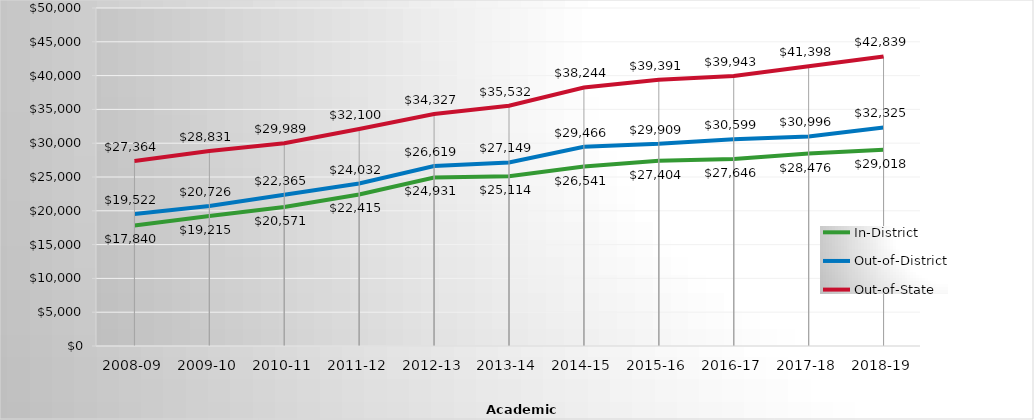
| Category | In-District | Out-of-District | Out-of-State |
|---|---|---|---|
| 2008-09 | 17839.697 | 19521.65 | 27363.58 |
| 2009-10 | 19215 | 20726 | 28831 |
| 2010-11 | 20571 | 22365 | 29989 |
| 2011-12 | 22415 | 24032 | 32100 |
| 2012-13 | 24931 | 26619 | 34327 |
| 2013-14 | 25114.27 | 27148.6 | 35532.25 |
| 2014-15 | 26541.34 | 29465.87 | 38243.8 |
| 2015-16 | 27404 | 29909 | 39391 |
| 2016-17 | 27646 | 30599 | 39943 |
| 2017-18 | 28476 | 30996 | 41398 |
| 2018-19 | 29018 | 32325 | 42839 |